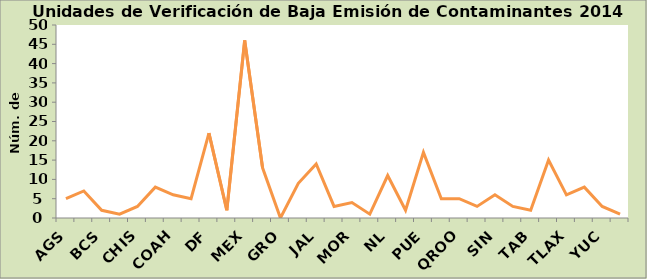
| Category | 5 7 2 1 3 8 6 5 22 |
|---|---|
| AGS | 5 |
| BC | 7 |
| BCS | 2 |
| CAM | 1 |
| CHIS | 3 |
| CHIH | 8 |
| COAH | 6 |
| COL | 5 |
| DF | 22 |
| DGO | 2 |
| MEX | 46 |
| GTO | 13 |
| GRO | 0 |
| HGO | 9 |
| JAL | 14 |
| MICH | 3 |
| MOR | 4 |
| NAY | 1 |
| NL | 11 |
| OAX | 2 |
| PUE | 17 |
| QRO | 5 |
| QROO | 5 |
| SLP | 3 |
| SIN | 6 |
| SON | 3 |
| TAB | 2 |
| TAM | 15 |
| TLAX | 6 |
| VER | 8 |
| YUC | 3 |
| ZAC | 1 |